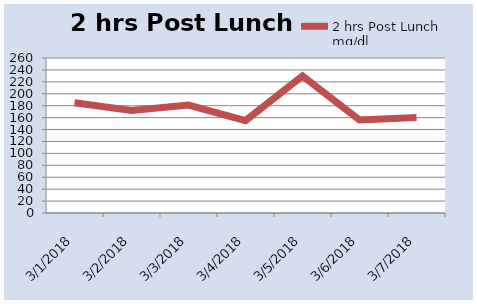
| Category | 2 hrs Post Lunch mg/dl |
|---|---|
| 01/03/2018 | 185 |
| 02/03/2018 | 172 |
| 03/03/2018 | 181 |
| 04/03/2018 | 155 |
| 05/03/2018 | 230 |
| 06/03/2018 | 156 |
| 07/03/2018 | 160 |